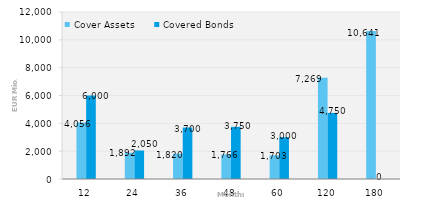
| Category | Cover Assets | Covered Bonds |
|---|---|---|
| 12.0 | 4055.868 | 6000 |
| 24.0 | 1891.527 | 2050 |
| 36.0 | 1820.208 | 3700 |
| 48.0 | 1765.995 | 3750 |
| 60.0 | 1703.371 | 3000 |
| 120.0 | 7269.132 | 4750 |
| 180.0 | 10640.987 | 0 |